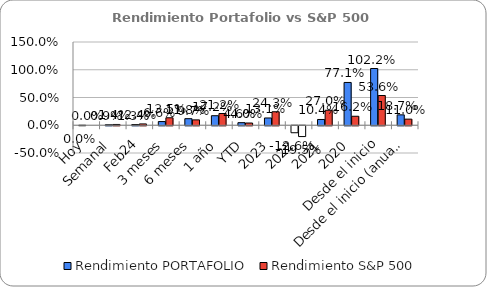
| Category | Rendimiento PORTAFOLIO | Rendimiento S&P 500 |
|---|---|---|
| Hoy | 0 | 0 |
| Semanal | 0.009 | 0.014 |
| Feb24 | 0.013 | 0.024 |
| 3 meses | 0.066 | 0.135 |
| 6 meses | 0.118 | 0.097 |
| 1 año | 0.172 | 0.212 |
| YTD | 0.046 | 0.04 |
| 2023 | 0.131 | 0.243 |
| 2022 | -0.126 | -0.195 |
| 2021 | 0.104 | 0.27 |
| 2020 | 0.771 | 0.162 |
| Desde el inicio | 1.022 | 0.536 |
| Desde el inicio (anual) | 0.187 | 0.11 |